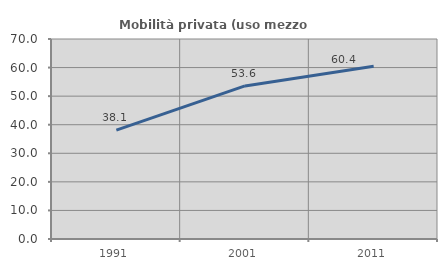
| Category | Mobilità privata (uso mezzo privato) |
|---|---|
| 1991.0 | 38.112 |
| 2001.0 | 53.569 |
| 2011.0 | 60.438 |